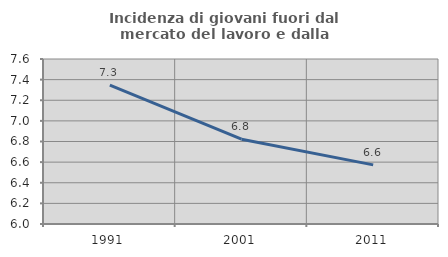
| Category | Incidenza di giovani fuori dal mercato del lavoro e dalla formazione  |
|---|---|
| 1991.0 | 7.347 |
| 2001.0 | 6.823 |
| 2011.0 | 6.573 |